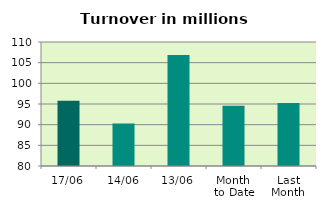
| Category | Series 0 |
|---|---|
| 17/06 | 95.791 |
| 14/06 | 90.273 |
| 13/06 | 106.833 |
| Month 
to Date | 94.59 |
| Last
Month | 95.269 |